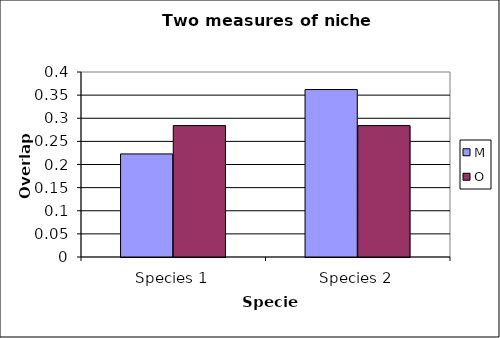
| Category | M | O |
|---|---|---|
| 0 | 0.223 | 0.284 |
| 1 | 0.362 | 0.284 |